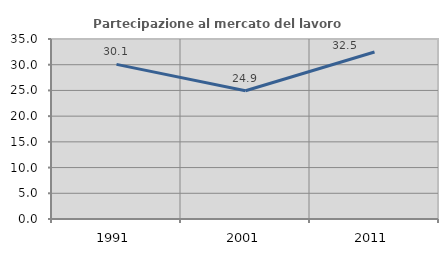
| Category | Partecipazione al mercato del lavoro  femminile |
|---|---|
| 1991.0 | 30.065 |
| 2001.0 | 24.932 |
| 2011.0 | 32.467 |